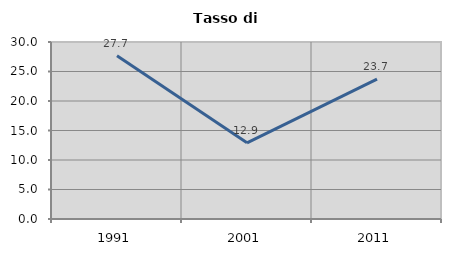
| Category | Tasso di disoccupazione   |
|---|---|
| 1991.0 | 27.668 |
| 2001.0 | 12.903 |
| 2011.0 | 23.715 |